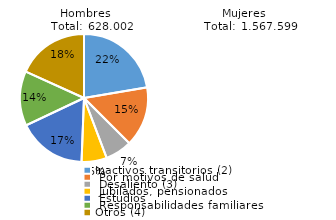
| Category | Series 0 |
|---|---|
| Inactivos transitorios (2) | 0.222 |
| Por motivos de salud  | 0.151 |
| Desaliento (3) | 0.067 |
| Jubilados, pensionados | 0.063 |
| Estudios | 0.173 |
| Responsabilidades familiares | 0.137 |
| Otros (4) | 0.181 |